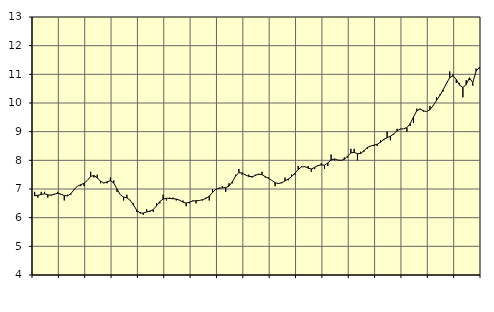
| Category | Piggar | Offentlig förvaltning m.m., SNI 84, 99 |
|---|---|---|
| nan | 6.9 | 6.76 |
| 87.0 | 6.7 | 6.78 |
| 87.0 | 6.9 | 6.81 |
| 87.0 | 6.9 | 6.83 |
| nan | 6.7 | 6.8 |
| 88.0 | 6.8 | 6.78 |
| 88.0 | 6.8 | 6.82 |
| 88.0 | 6.9 | 6.85 |
| nan | 6.8 | 6.82 |
| 89.0 | 6.6 | 6.77 |
| 89.0 | 6.8 | 6.76 |
| 89.0 | 6.8 | 6.84 |
| nan | 7 | 6.98 |
| 90.0 | 7.1 | 7.1 |
| 90.0 | 7.1 | 7.15 |
| 90.0 | 7.1 | 7.2 |
| nan | 7.3 | 7.3 |
| 91.0 | 7.6 | 7.44 |
| 91.0 | 7.4 | 7.47 |
| 91.0 | 7.5 | 7.39 |
| nan | 7.2 | 7.27 |
| 92.0 | 7.2 | 7.21 |
| 92.0 | 7.2 | 7.25 |
| 92.0 | 7.4 | 7.29 |
| nan | 7.3 | 7.21 |
| 93.0 | 6.9 | 7 |
| 93.0 | 6.8 | 6.8 |
| 93.0 | 6.6 | 6.72 |
| nan | 6.8 | 6.69 |
| 94.0 | 6.6 | 6.61 |
| 94.0 | 6.5 | 6.44 |
| 94.0 | 6.2 | 6.26 |
| nan | 6.2 | 6.16 |
| 95.0 | 6.1 | 6.16 |
| 95.0 | 6.3 | 6.2 |
| 95.0 | 6.2 | 6.23 |
| nan | 6.2 | 6.28 |
| 96.0 | 6.5 | 6.41 |
| 96.0 | 6.5 | 6.56 |
| 96.0 | 6.8 | 6.65 |
| nan | 6.6 | 6.68 |
| 97.0 | 6.7 | 6.67 |
| 97.0 | 6.7 | 6.66 |
| 97.0 | 6.6 | 6.65 |
| nan | 6.6 | 6.61 |
| 98.0 | 6.6 | 6.54 |
| 98.0 | 6.4 | 6.51 |
| 98.0 | 6.5 | 6.54 |
| nan | 6.6 | 6.58 |
| 99.0 | 6.5 | 6.59 |
| 99.0 | 6.6 | 6.6 |
| 99.0 | 6.6 | 6.63 |
| nan | 6.7 | 6.67 |
| 0.0 | 6.6 | 6.75 |
| 0.0 | 7 | 6.88 |
| 0.0 | 7 | 6.99 |
| nan | 7 | 7.03 |
| 1.0 | 7.1 | 7.04 |
| 1.0 | 6.9 | 7.05 |
| 1.0 | 7.2 | 7.1 |
| nan | 7.2 | 7.25 |
| 2.0 | 7.5 | 7.45 |
| 2.0 | 7.7 | 7.57 |
| 2.0 | 7.5 | 7.56 |
| nan | 7.5 | 7.49 |
| 3.0 | 7.5 | 7.44 |
| 3.0 | 7.4 | 7.43 |
| 3.0 | 7.5 | 7.47 |
| nan | 7.5 | 7.52 |
| 4.0 | 7.6 | 7.5 |
| 4.0 | 7.4 | 7.43 |
| 4.0 | 7.4 | 7.37 |
| nan | 7.3 | 7.3 |
| 5.0 | 7.1 | 7.22 |
| 5.0 | 7.2 | 7.19 |
| 5.0 | 7.2 | 7.22 |
| nan | 7.4 | 7.28 |
| 6.0 | 7.3 | 7.35 |
| 6.0 | 7.5 | 7.43 |
| 6.0 | 7.5 | 7.55 |
| nan | 7.8 | 7.68 |
| 7.0 | 7.8 | 7.77 |
| 7.0 | 7.8 | 7.78 |
| 7.0 | 7.8 | 7.73 |
| nan | 7.6 | 7.7 |
| 8.0 | 7.7 | 7.75 |
| 8.0 | 7.8 | 7.82 |
| 8.0 | 7.9 | 7.84 |
| nan | 7.7 | 7.83 |
| 9.0 | 7.8 | 7.91 |
| 9.0 | 8.2 | 8.01 |
| 9.0 | 8 | 8.05 |
| nan | 8 | 8.01 |
| 10.0 | 8 | 8 |
| 10.0 | 8.1 | 8.03 |
| 10.0 | 8.1 | 8.15 |
| nan | 8.4 | 8.26 |
| 11.0 | 8.4 | 8.28 |
| 11.0 | 8 | 8.23 |
| 11.0 | 8.3 | 8.24 |
| nan | 8.3 | 8.34 |
| 12.0 | 8.4 | 8.45 |
| 12.0 | 8.5 | 8.5 |
| 12.0 | 8.5 | 8.53 |
| nan | 8.5 | 8.56 |
| 13.0 | 8.7 | 8.63 |
| 13.0 | 8.7 | 8.74 |
| 13.0 | 9 | 8.79 |
| nan | 8.7 | 8.84 |
| 14.0 | 8.9 | 8.92 |
| 14.0 | 9.1 | 9.03 |
| 14.0 | 9.1 | 9.09 |
| nan | 9.1 | 9.1 |
| 15.0 | 9 | 9.14 |
| 15.0 | 9.2 | 9.28 |
| 15.0 | 9.3 | 9.51 |
| nan | 9.8 | 9.73 |
| 16.0 | 9.8 | 9.79 |
| 16.0 | 9.7 | 9.73 |
| 16.0 | 9.7 | 9.7 |
| nan | 9.9 | 9.77 |
| 17.0 | 9.9 | 9.91 |
| 17.0 | 10.2 | 10.09 |
| 17.0 | 10.3 | 10.26 |
| nan | 10.4 | 10.46 |
| 18.0 | 10.7 | 10.68 |
| 18.0 | 11.1 | 10.88 |
| 18.0 | 11 | 10.95 |
| nan | 10.7 | 10.82 |
| 19.0 | 10.7 | 10.62 |
| 19.0 | 10.2 | 10.54 |
| 19.0 | 10.8 | 10.64 |
| nan | 10.8 | 10.88 |
| 20.0 | 10.6 | 10.71 |
| 20.0 | 11.2 | 11.11 |
| 20.0 | 11.2 | 11.24 |